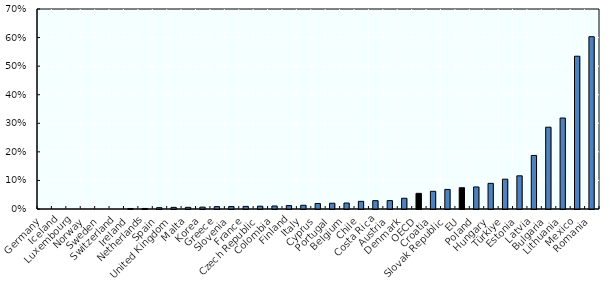
| Category | Series 0 |
|---|---|
| Germany | 0 |
| Iceland | 0 |
| Luxembourg | 0 |
| Norway | 0 |
| Sweden | 0 |
| Switzerland | 0 |
| Ireland | 0.002 |
| Netherlands | 0.002 |
| Spain | 0.005 |
| United Kingdom | 0.006 |
| Malta | 0.006 |
| Korea | 0.007 |
| Greece | 0.008 |
| Slovenia | 0.009 |
| France | 0.009 |
| Czech Republic | 0.01 |
| Colombia | 0.01 |
| Finland | 0.012 |
| Italy | 0.013 |
| Cyprus | 0.019 |
| Portugal | 0.02 |
| Belgium | 0.021 |
| Chile | 0.027 |
| Costa Rica | 0.029 |
| Austria | 0.029 |
| Denmark | 0.038 |
| OECD | 0.055 |
| Croatia | 0.062 |
| Slovak Republic | 0.068 |
| EU | 0.074 |
| Poland | 0.077 |
| Hungary | 0.09 |
| Türkiye | 0.104 |
| Estonia | 0.116 |
| Latvia | 0.187 |
| Bulgaria | 0.286 |
| Lithuania | 0.318 |
| Mexico | 0.535 |
| Romania | 0.603 |